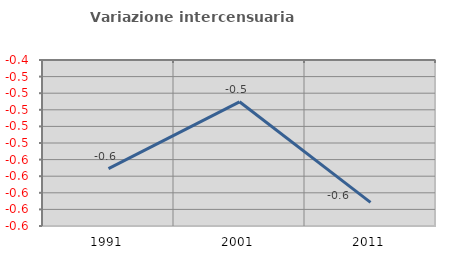
| Category | Variazione intercensuaria annua |
|---|---|
| 1991.0 | -0.571 |
| 2001.0 | -0.49 |
| 2011.0 | -0.612 |